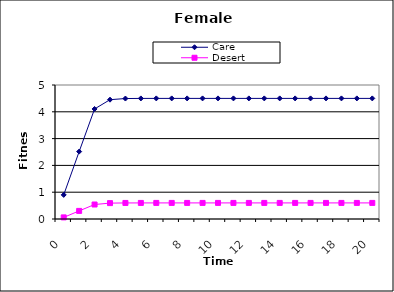
| Category | Care | Desert |
|---|---|---|
| 0.0 | 0.9 | 0.06 |
| 1.0 | 2.515 | 0.302 |
| 2.0 | 4.106 | 0.541 |
| 3.0 | 4.452 | 0.593 |
| 4.0 | 4.495 | 0.599 |
| 5.0 | 4.499 | 0.6 |
| 6.0 | 4.5 | 0.6 |
| 7.0 | 4.5 | 0.6 |
| 8.0 | 4.5 | 0.6 |
| 9.0 | 4.5 | 0.6 |
| 10.0 | 4.5 | 0.6 |
| 11.0 | 4.5 | 0.6 |
| 12.0 | 4.5 | 0.6 |
| 13.0 | 4.5 | 0.6 |
| 14.0 | 4.5 | 0.6 |
| 15.0 | 4.5 | 0.6 |
| 16.0 | 4.5 | 0.6 |
| 17.0 | 4.5 | 0.6 |
| 18.0 | 4.5 | 0.6 |
| 19.0 | 4.5 | 0.6 |
| 20.0 | 4.5 | 0.6 |